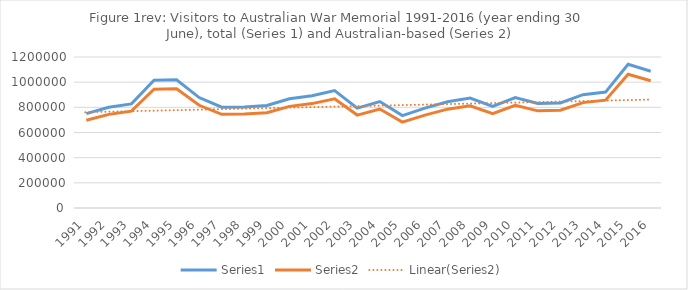
| Category | Series 0 | Series 1 |
|---|---|---|
| 1991.0 | 750000 | 697500 |
| 1992.0 | 800000 | 744000 |
| 1993.0 | 827327 | 769414 |
| 1994.0 | 1015781 | 944676 |
| 1995.0 | 1019279 | 947929 |
| 1996.0 | 877680 | 816242 |
| 1997.0 | 800790 | 744735 |
| 1998.0 | 802950 | 746743 |
| 1999.0 | 814850 | 757810 |
| 2000.0 | 868600 | 807798 |
| 2001.0 | 892017 | 829576 |
| 2002.0 | 933200 | 867876 |
| 2003.0 | 794020 | 738439 |
| 2004.0 | 845995 | 786775 |
| 2005.0 | 733975 | 682597 |
| 2006.0 | 793335 | 737802 |
| 2007.0 | 844899 | 785576 |
| 2008.0 | 873547 | 812399 |
| 2009.0 | 807066 | 750571 |
| 2010.0 | 877000 | 815610 |
| 2011.0 | 830000 | 771900 |
| 2012.0 | 835000 | 776550 |
| 2013.0 | 900500 | 837465 |
| 2014.0 | 921300 | 856809 |
| 2015.0 | 1142814 | 1062817 |
| 2016.0 | 1087000 | 1010910 |